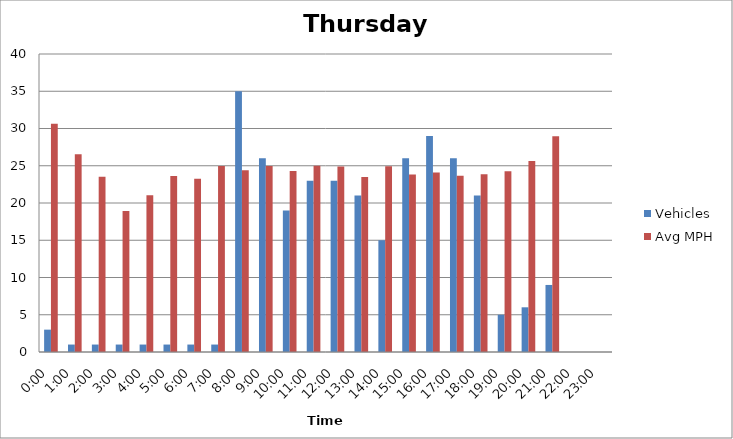
| Category | Vehicles | Avg MPH |
|---|---|---|
| 0:00 | 3 | 30.64 |
| 1:00 | 1 | 26.55 |
| 2:00 | 1 | 23.52 |
| 3:00 | 1 | 18.93 |
| 4:00 | 1 | 21.03 |
| 5:00 | 1 | 23.63 |
| 6:00 | 1 | 23.24 |
| 7:00 | 1 | 24.95 |
| 8:00 | 35 | 24.4 |
| 9:00 | 26 | 24.97 |
| 10:00 | 19 | 24.28 |
| 11:00 | 23 | 25.01 |
| 12:00 | 23 | 24.89 |
| 13:00 | 21 | 23.48 |
| 14:00 | 15 | 24.93 |
| 15:00 | 26 | 23.83 |
| 16:00 | 29 | 24.11 |
| 17:00 | 26 | 23.65 |
| 18:00 | 21 | 23.87 |
| 19:00 | 5 | 24.25 |
| 20:00 | 6 | 25.65 |
| 21:00 | 9 | 28.97 |
| 22:00 | 0 | 0 |
| 23:00 | 0 | 0 |